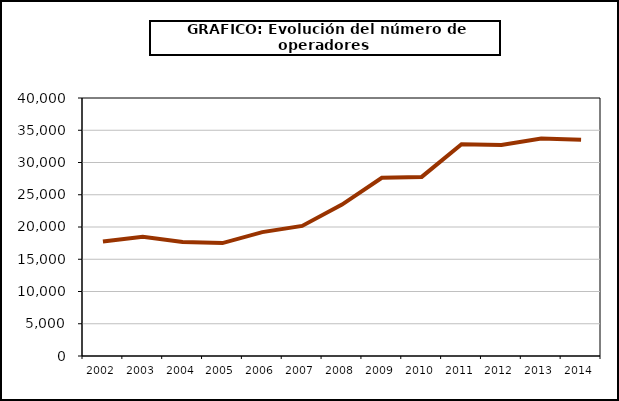
| Category | Operadores (*) |
|---|---|
| 2002.0 | 17751 |
| 2003.0 | 18505 |
| 2004.0 | 17688 |
| 2005.0 | 17509 |
| 2006.0 | 19211 |
| 2007.0 | 20171 |
| 2008.0 | 23473 |
| 2009.0 | 27627 |
| 2010.0 | 27767 |
| 2011.0 | 32837 |
| 2012.0 | 32724 |
| 2013.0 | 33704 |
| 2014.0 | 33539 |